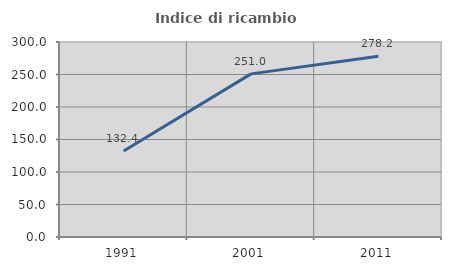
| Category | Indice di ricambio occupazionale  |
|---|---|
| 1991.0 | 132.398 |
| 2001.0 | 250.951 |
| 2011.0 | 278.209 |